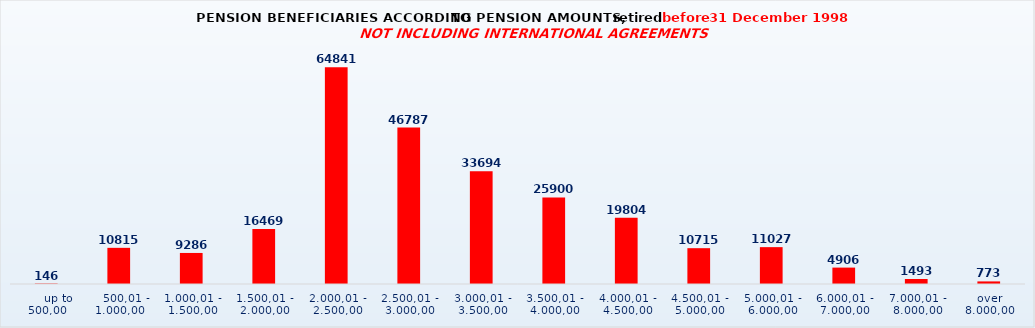
| Category | Series 0 |
|---|---|
|      up to 500,00 | 146 |
|    500,01 - 1.000,00 | 10815 |
| 1.000,01 - 1.500,00 | 9286 |
| 1.500,01 - 2.000,00 | 16469 |
| 2.000,01 - 2.500,00 | 64841 |
| 2.500,01 - 3.000,00 | 46787 |
| 3.000,01 - 3.500,00 | 33694 |
| 3.500,01 - 4.000,00 | 25900 |
| 4.000,01 - 4.500,00 | 19804 |
| 4.500,01 - 5.000,00 | 10715 |
| 5.000,01 - 6.000,00 | 11027 |
| 6.000,01 - 7.000,00 | 4906 |
| 7.000,01 - 8.000,00 | 1493 |
| over 8.000,00 | 773 |